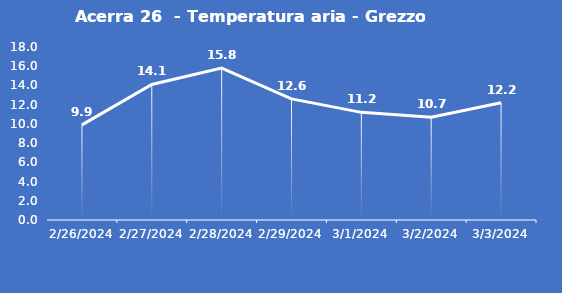
| Category | Acerra 26  - Temperatura aria - Grezzo (°C) |
|---|---|
| 2/26/24 | 9.9 |
| 2/27/24 | 14.1 |
| 2/28/24 | 15.8 |
| 2/29/24 | 12.6 |
| 3/1/24 | 11.2 |
| 3/2/24 | 10.7 |
| 3/3/24 | 12.2 |